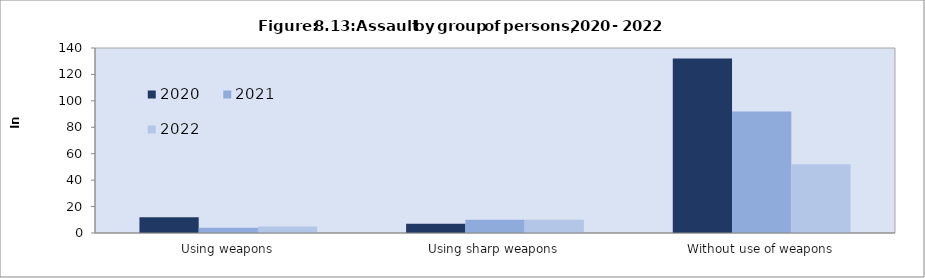
| Category | 2020  | 2021  | 2022  |
|---|---|---|---|
| Using weapons | 12 | 4 | 5 |
| Using sharp weapons | 7 | 10 | 10 |
| Without use of weapons | 132 | 92 | 52 |